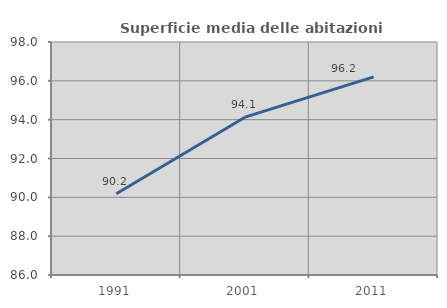
| Category | Superficie media delle abitazioni occupate |
|---|---|
| 1991.0 | 90.183 |
| 2001.0 | 94.129 |
| 2011.0 | 96.206 |